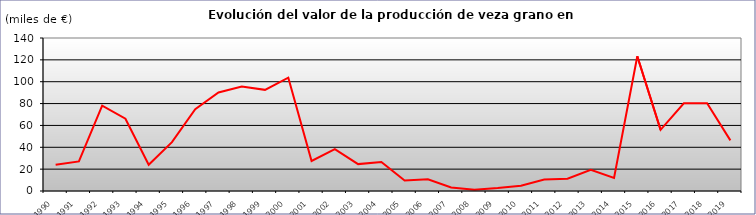
| Category | VALOR 
(miles de €) |
|---|---|
| 1990.0 | 24.04 |
| 1991.0 | 27.046 |
| 1992.0 | 78.132 |
| 1993.0 | 66.111 |
| 1994.0 | 24.04 |
| 1995.0 | 44.715 |
| 1996.0 | 74.766 |
| 1997.0 | 90.152 |
| 1998.0 | 95.561 |
| 1999.0 | 92.556 |
| 2000.0 | 103.7 |
| 2001.0 | 27.5 |
| 2002.0 | 38.3 |
| 2003.0 | 24.6 |
| 2004.0 | 26.5 |
| 2005.0 | 9.6 |
| 2006.0 | 10.7 |
| 2007.0 | 3.3 |
| 2008.0 | 1.1 |
| 2009.0 | 2.7 |
| 2010.0 | 4.8 |
| 2011.0 | 10.6 |
| 2012.0 | 11.2 |
| 2013.0 | 19.44 |
| 2014.0 | 12 |
| 2015.0 | 123.3 |
| 2016.0 | 55.98 |
| 2017.0 | 80.31 |
| 2018.0 | 80.38 |
| 2019.0 | 46.32 |